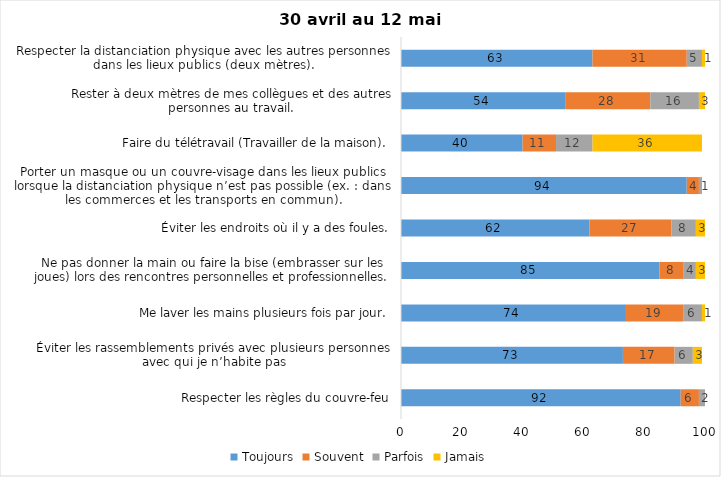
| Category | Toujours | Souvent | Parfois | Jamais |
|---|---|---|---|---|
| Respecter les règles du couvre-feu | 92 | 6 | 2 | 0 |
| Éviter les rassemblements privés avec plusieurs personnes avec qui je n’habite pas | 73 | 17 | 6 | 3 |
| Me laver les mains plusieurs fois par jour. | 74 | 19 | 6 | 1 |
| Ne pas donner la main ou faire la bise (embrasser sur les joues) lors des rencontres personnelles et professionnelles. | 85 | 8 | 4 | 3 |
| Éviter les endroits où il y a des foules. | 62 | 27 | 8 | 3 |
| Porter un masque ou un couvre-visage dans les lieux publics lorsque la distanciation physique n’est pas possible (ex. : dans les commerces et les transports en commun). | 94 | 4 | 1 | 0 |
| Faire du télétravail (Travailler de la maison). | 40 | 11 | 12 | 36 |
| Rester à deux mètres de mes collègues et des autres personnes au travail. | 54 | 28 | 16 | 3 |
| Respecter la distanciation physique avec les autres personnes dans les lieux publics (deux mètres). | 63 | 31 | 5 | 1 |